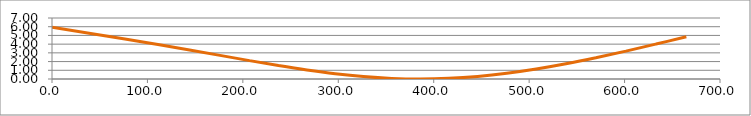
| Category | Series 0 |
|---|---|
| 0.0 | 5.929 |
| 76.437 | 4.588 |
| 111.06 | 3.962 |
| 144.168 | 3.335 |
| 176.058 | 2.714 |
| 207.013 | 2.11 |
| 237.297 | 1.541 |
| 267.143 | 1.031 |
| 296.757 | 0.601 |
| 326.305 | 0.274 |
| 355.921 | 0.069 |
| 385.704 | 0 |
| 415.72 | 0.074 |
| 446.009 | 0.293 |
| 476.584 | 0.653 |
| 507.44 | 1.141 |
| 538.555 | 1.742 |
| 569.89 | 2.436 |
| 601.401 | 3.2 |
| 633.032 | 4.01 |
| 664.725 | 4.84 |